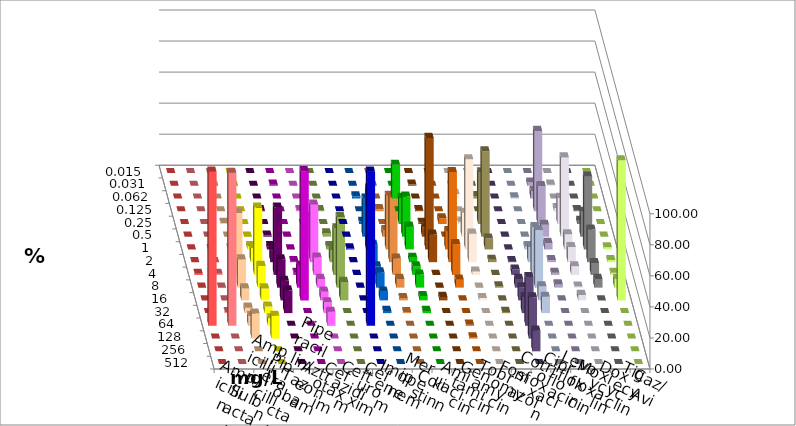
| Category | Ampicillin | Ampicillin/ Sulbactam | Piperacillin | Piperacillin/ Tazobactam | Aztreonam | Cefotaxim | Ceftazidim | Cefuroxim | Imipenem | Meropenem | Colistin | Amikacin | Gentamicin | Tobramycin | Fosfomycin | Cotrimoxazol | Ciprofloxacin | Levofloxacin | Moxifloxacin | Doxycyclin | Tigecyclin | Caz/Avi |
|---|---|---|---|---|---|---|---|---|---|---|---|---|---|---|---|---|---|---|---|---|---|---|
| 0.015 | 0 | 0 | 0 | 0 | 0 | 0 | 0 | 0 | 0 | 0 | 0 | 0 | 0 | 0 | 0 | 0 | 0 | 0 | 0 | 0 | 0 | 0 |
| 0.031 | 0 | 0 | 0 | 0 | 0 | 0.699 | 0 | 0 | 0 | 0 | 0.741 | 0 | 0 | 0 | 0 | 0 | 2.098 | 0.699 | 0 | 0 | 0 | 0 |
| 0.062 | 0 | 0 | 0 | 0 | 0 | 0 | 0 | 0 | 1.399 | 21.678 | 0 | 0 | 2.941 | 1.55 | 0 | 0.699 | 4.895 | 0 | 0 | 0 | 0 | 0 |
| 0.125 | 0 | 0 | 0 | 0 | 0.699 | 0 | 0.699 | 0 | 0 | 0 | 0.741 | 0 | 0 | 0 | 0 | 0 | 51.748 | 2.098 | 0.699 | 0 | 0.699 | 1.408 |
| 0.25 | 0 | 0 | 0.699 | 0 | 0 | 0 | 0 | 0 | 1.399 | 16.783 | 0.741 | 3.676 | 1.471 | 33.333 | 0 | 0 | 24.476 | 16.783 | 2.098 | 0 | 0 | 0 |
| 0.5 | 0 | 0 | 0 | 0 | 0.699 | 0 | 2.797 | 0 | 24.476 | 25.874 | 5.926 | 0 | 15.441 | 55.039 | 0 | 0 | 7.692 | 51.049 | 16.084 | 0 | 2.098 | 4.225 |
| 1.0 | 0 | 0 | 0.699 | 2.098 | 2.098 | 0 | 20.979 | 0.699 | 39.161 | 14.685 | 71.852 | 11.765 | 58.088 | 6.977 | 0 | 2.098 | 4.196 | 9.79 | 46.853 | 1.399 | 2.098 | 34.507 |
| 2.0 | 0 | 0 | 6.993 | 9.091 | 7.692 | 0.699 | 37.063 | 0 | 11.189 | 2.797 | 17.778 | 58.088 | 18.382 | 1.55 | 0.699 | 9.79 | 1.399 | 9.79 | 20.979 | 1.399 | 7.692 | 41.549 |
| 4.0 | 0.699 | 0.699 | 39.86 | 43.357 | 43.357 | 1.399 | 11.189 | 0 | 5.594 | 5.594 | 0 | 19.853 | 2.206 | 0 | 3.497 | 30.769 | 1.399 | 5.594 | 7.692 | 1.399 | 30.07 | 10.563 |
| 8.0 | 0 | 0 | 18.182 | 13.986 | 18.182 | 13.986 | 5.594 | 0 | 9.79 | 8.392 | 0 | 5.147 | 0 | 0.775 | 5.594 | 37.063 | 2.098 | 0.699 | 5.594 | 5.594 | 45.455 | 5.634 |
| 16.0 | 0 | 0 | 7.692 | 7.692 | 12.587 | 83.217 | 5.594 | 0 | 5.594 | 2.797 | 2.222 | 0 | 1.471 | 0 | 8.392 | 9.091 | 0 | 3.497 | 0 | 90.21 | 11.888 | 1.408 |
| 32.0 | 0 | 0.699 | 3.497 | 4.196 | 14.685 | 0 | 6.993 | 0 | 1.399 | 1.399 | 0 | 0 | 0 | 0.775 | 10.49 | 10.49 | 0 | 0 | 0 | 0 | 0 | 0.704 |
| 64.0 | 99.301 | 98.601 | 6.294 | 4.895 | 0 | 0 | 9.091 | 99.301 | 0 | 0 | 0 | 0.735 | 0 | 0 | 31.469 | 0 | 0 | 0 | 0 | 0 | 0 | 0 |
| 128.0 | 0 | 0 | 16.084 | 14.685 | 0 | 0 | 0 | 0 | 0 | 0 | 0 | 0.735 | 0 | 0 | 26.573 | 0 | 0 | 0 | 0 | 0 | 0 | 0 |
| 256.0 | 0 | 0 | 0 | 0 | 0 | 0 | 0 | 0 | 0 | 0 | 0 | 0 | 0 | 0 | 13.287 | 0 | 0 | 0 | 0 | 0 | 0 | 0 |
| 512.0 | 0 | 0 | 0 | 0 | 0 | 0 | 0 | 0 | 0 | 0 | 0 | 0 | 0 | 0 | 0 | 0 | 0 | 0 | 0 | 0 | 0 | 0 |